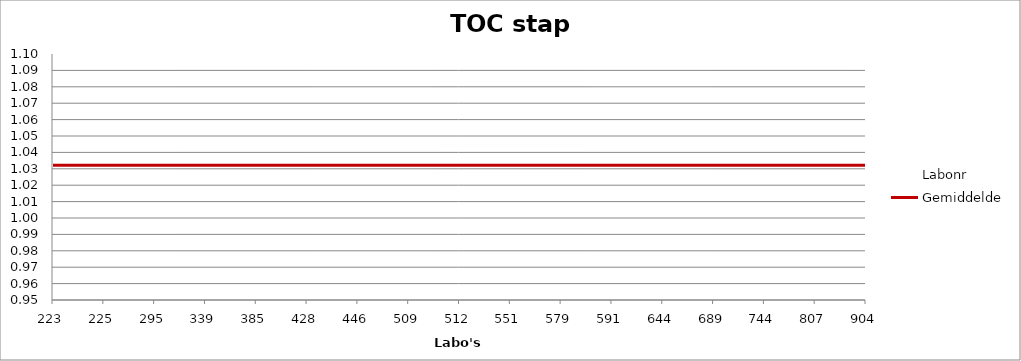
| Category | Labonr | Gemiddelde |
|---|---|---|
| 223.0 | 0.998 | 1.032 |
| 225.0 | 1.024 | 1.032 |
| 295.0 | 1.028 | 1.032 |
| 339.0 | 1.041 | 1.032 |
| 385.0 | 1.078 | 1.032 |
| 428.0 | 1.041 | 1.032 |
| 446.0 | 1.041 | 1.032 |
| 509.0 | 1.115 | 1.032 |
| 512.0 | 1.059 | 1.032 |
| 551.0 | 1.011 | 1.032 |
| 579.0 | 1.004 | 1.032 |
| 591.0 | 1.011 | 1.032 |
| 644.0 | 1.02 | 1.032 |
| 689.0 | 0.987 | 1.032 |
| 744.0 | 1.011 | 1.032 |
| 807.0 | 1.035 | 1.032 |
| 904.0 | 1.076 | 1.032 |